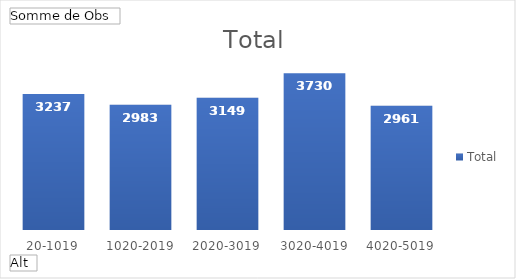
| Category | Total |
|---|---|
| 20-1019 | 3237 |
| 1020-2019 | 2983 |
| 2020-3019 | 3149 |
| 3020-4019 | 3730 |
| 4020-5019 | 2961 |